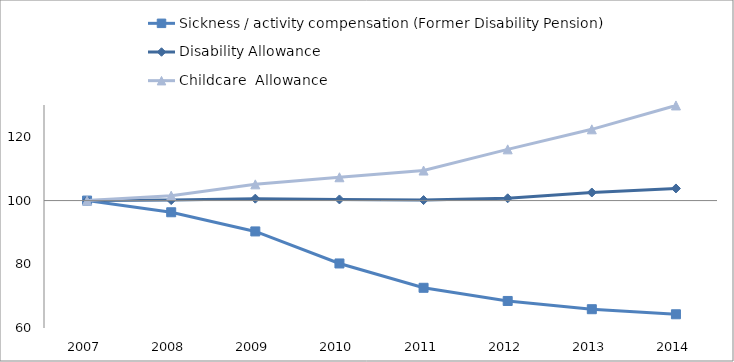
| Category | Sickness / activity compensation (Former Disability Pension) | Disability Allowance | Childcare  Allowance | 0 |
|---|---|---|---|---|
| 2007.0 | 100 | 100 | 100 |  |
| 2008.0 | 96.332 | 100.15 | 101.533 |  |
| 2009.0 | 90.313 | 100.6 | 105.093 |  |
| 2010.0 | 80.256 | 100.352 | 107.318 |  |
| 2011.0 | 72.621 | 100.158 | 109.425 |  |
| 2012.0 | 68.485 | 100.71 | 116.076 |  |
| 2013.0 | 65.9 | 102.534 | 122.365 |  |
| 2014.0 | 64.31 | 103.806 | 129.86 |  |